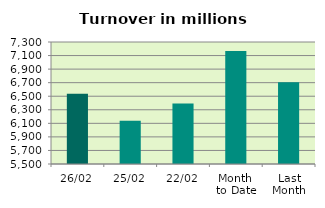
| Category | Series 0 |
|---|---|
| 26/02 | 6537.195 |
| 25/02 | 6136.432 |
| 22/02 | 6393.437 |
| Month 
to Date | 7166.27 |
| Last
Month | 6707.699 |